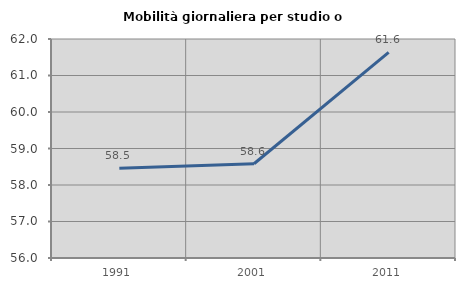
| Category | Mobilità giornaliera per studio o lavoro |
|---|---|
| 1991.0 | 58.456 |
| 2001.0 | 58.583 |
| 2011.0 | 61.635 |